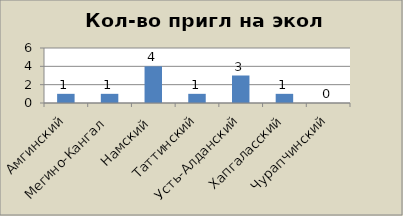
| Category | экол |
|---|---|
| Амгинский | 1 |
| Мегино-Кангал | 1 |
| Намский | 4 |
| Таттинский | 1 |
| Усть-Алданский | 3 |
| Хапгаласский | 1 |
| Чурапчинский | 0 |